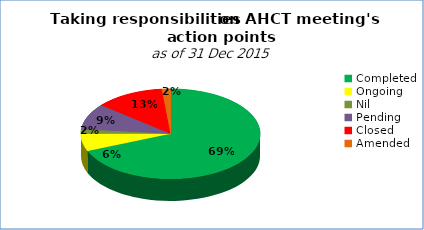
| Category | Series 0 |
|---|---|
| Completed | 44 |
| Ongoing | 4 |
| Nil | 1 |
| Pending | 6 |
| Closed | 8 |
| Amended | 1 |